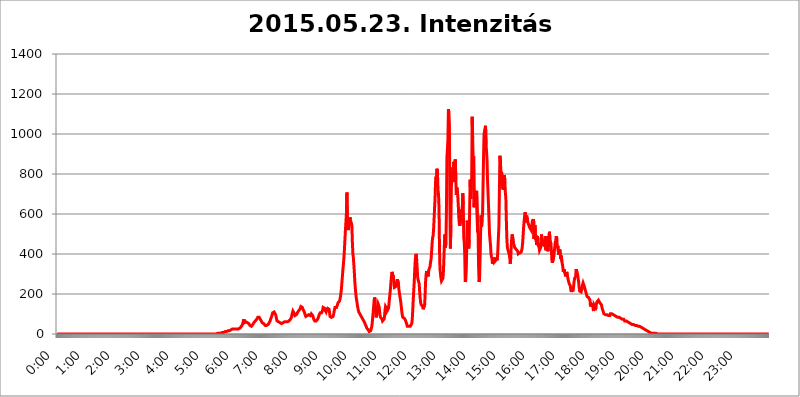
| Category | 2015.05.23. Intenzitás [W/m^2] |
|---|---|
| 0.0 | 0 |
| 0.0006944444444444445 | 0 |
| 0.001388888888888889 | 0 |
| 0.0020833333333333333 | 0 |
| 0.002777777777777778 | 0 |
| 0.003472222222222222 | 0 |
| 0.004166666666666667 | 0 |
| 0.004861111111111111 | 0 |
| 0.005555555555555556 | 0 |
| 0.0062499999999999995 | 0 |
| 0.006944444444444444 | 0 |
| 0.007638888888888889 | 0 |
| 0.008333333333333333 | 0 |
| 0.009027777777777779 | 0 |
| 0.009722222222222222 | 0 |
| 0.010416666666666666 | 0 |
| 0.011111111111111112 | 0 |
| 0.011805555555555555 | 0 |
| 0.012499999999999999 | 0 |
| 0.013194444444444444 | 0 |
| 0.013888888888888888 | 0 |
| 0.014583333333333332 | 0 |
| 0.015277777777777777 | 0 |
| 0.015972222222222224 | 0 |
| 0.016666666666666666 | 0 |
| 0.017361111111111112 | 0 |
| 0.018055555555555557 | 0 |
| 0.01875 | 0 |
| 0.019444444444444445 | 0 |
| 0.02013888888888889 | 0 |
| 0.020833333333333332 | 0 |
| 0.02152777777777778 | 0 |
| 0.022222222222222223 | 0 |
| 0.02291666666666667 | 0 |
| 0.02361111111111111 | 0 |
| 0.024305555555555556 | 0 |
| 0.024999999999999998 | 0 |
| 0.025694444444444447 | 0 |
| 0.02638888888888889 | 0 |
| 0.027083333333333334 | 0 |
| 0.027777777777777776 | 0 |
| 0.02847222222222222 | 0 |
| 0.029166666666666664 | 0 |
| 0.029861111111111113 | 0 |
| 0.030555555555555555 | 0 |
| 0.03125 | 0 |
| 0.03194444444444445 | 0 |
| 0.03263888888888889 | 0 |
| 0.03333333333333333 | 0 |
| 0.034027777777777775 | 0 |
| 0.034722222222222224 | 0 |
| 0.035416666666666666 | 0 |
| 0.036111111111111115 | 0 |
| 0.03680555555555556 | 0 |
| 0.0375 | 0 |
| 0.03819444444444444 | 0 |
| 0.03888888888888889 | 0 |
| 0.03958333333333333 | 0 |
| 0.04027777777777778 | 0 |
| 0.04097222222222222 | 0 |
| 0.041666666666666664 | 0 |
| 0.042361111111111106 | 0 |
| 0.04305555555555556 | 0 |
| 0.043750000000000004 | 0 |
| 0.044444444444444446 | 0 |
| 0.04513888888888889 | 0 |
| 0.04583333333333334 | 0 |
| 0.04652777777777778 | 0 |
| 0.04722222222222222 | 0 |
| 0.04791666666666666 | 0 |
| 0.04861111111111111 | 0 |
| 0.049305555555555554 | 0 |
| 0.049999999999999996 | 0 |
| 0.05069444444444445 | 0 |
| 0.051388888888888894 | 0 |
| 0.052083333333333336 | 0 |
| 0.05277777777777778 | 0 |
| 0.05347222222222222 | 0 |
| 0.05416666666666667 | 0 |
| 0.05486111111111111 | 0 |
| 0.05555555555555555 | 0 |
| 0.05625 | 0 |
| 0.05694444444444444 | 0 |
| 0.057638888888888885 | 0 |
| 0.05833333333333333 | 0 |
| 0.05902777777777778 | 0 |
| 0.059722222222222225 | 0 |
| 0.06041666666666667 | 0 |
| 0.061111111111111116 | 0 |
| 0.06180555555555556 | 0 |
| 0.0625 | 0 |
| 0.06319444444444444 | 0 |
| 0.06388888888888888 | 0 |
| 0.06458333333333334 | 0 |
| 0.06527777777777778 | 0 |
| 0.06597222222222222 | 0 |
| 0.06666666666666667 | 0 |
| 0.06736111111111111 | 0 |
| 0.06805555555555555 | 0 |
| 0.06874999999999999 | 0 |
| 0.06944444444444443 | 0 |
| 0.07013888888888889 | 0 |
| 0.07083333333333333 | 0 |
| 0.07152777777777779 | 0 |
| 0.07222222222222223 | 0 |
| 0.07291666666666667 | 0 |
| 0.07361111111111111 | 0 |
| 0.07430555555555556 | 0 |
| 0.075 | 0 |
| 0.07569444444444444 | 0 |
| 0.0763888888888889 | 0 |
| 0.07708333333333334 | 0 |
| 0.07777777777777778 | 0 |
| 0.07847222222222222 | 0 |
| 0.07916666666666666 | 0 |
| 0.0798611111111111 | 0 |
| 0.08055555555555556 | 0 |
| 0.08125 | 0 |
| 0.08194444444444444 | 0 |
| 0.08263888888888889 | 0 |
| 0.08333333333333333 | 0 |
| 0.08402777777777777 | 0 |
| 0.08472222222222221 | 0 |
| 0.08541666666666665 | 0 |
| 0.08611111111111112 | 0 |
| 0.08680555555555557 | 0 |
| 0.08750000000000001 | 0 |
| 0.08819444444444445 | 0 |
| 0.08888888888888889 | 0 |
| 0.08958333333333333 | 0 |
| 0.09027777777777778 | 0 |
| 0.09097222222222222 | 0 |
| 0.09166666666666667 | 0 |
| 0.09236111111111112 | 0 |
| 0.09305555555555556 | 0 |
| 0.09375 | 0 |
| 0.09444444444444444 | 0 |
| 0.09513888888888888 | 0 |
| 0.09583333333333333 | 0 |
| 0.09652777777777777 | 0 |
| 0.09722222222222222 | 0 |
| 0.09791666666666667 | 0 |
| 0.09861111111111111 | 0 |
| 0.09930555555555555 | 0 |
| 0.09999999999999999 | 0 |
| 0.10069444444444443 | 0 |
| 0.1013888888888889 | 0 |
| 0.10208333333333335 | 0 |
| 0.10277777777777779 | 0 |
| 0.10347222222222223 | 0 |
| 0.10416666666666667 | 0 |
| 0.10486111111111111 | 0 |
| 0.10555555555555556 | 0 |
| 0.10625 | 0 |
| 0.10694444444444444 | 0 |
| 0.1076388888888889 | 0 |
| 0.10833333333333334 | 0 |
| 0.10902777777777778 | 0 |
| 0.10972222222222222 | 0 |
| 0.1111111111111111 | 0 |
| 0.11180555555555556 | 0 |
| 0.11180555555555556 | 0 |
| 0.1125 | 0 |
| 0.11319444444444444 | 0 |
| 0.11388888888888889 | 0 |
| 0.11458333333333333 | 0 |
| 0.11527777777777777 | 0 |
| 0.11597222222222221 | 0 |
| 0.11666666666666665 | 0 |
| 0.1173611111111111 | 0 |
| 0.11805555555555557 | 0 |
| 0.11944444444444445 | 0 |
| 0.12013888888888889 | 0 |
| 0.12083333333333333 | 0 |
| 0.12152777777777778 | 0 |
| 0.12222222222222223 | 0 |
| 0.12291666666666667 | 0 |
| 0.12291666666666667 | 0 |
| 0.12361111111111112 | 0 |
| 0.12430555555555556 | 0 |
| 0.125 | 0 |
| 0.12569444444444444 | 0 |
| 0.12638888888888888 | 0 |
| 0.12708333333333333 | 0 |
| 0.16875 | 0 |
| 0.12847222222222224 | 0 |
| 0.12916666666666668 | 0 |
| 0.12986111111111112 | 0 |
| 0.13055555555555556 | 0 |
| 0.13125 | 0 |
| 0.13194444444444445 | 0 |
| 0.1326388888888889 | 0 |
| 0.13333333333333333 | 0 |
| 0.13402777777777777 | 0 |
| 0.13402777777777777 | 0 |
| 0.13472222222222222 | 0 |
| 0.13541666666666666 | 0 |
| 0.1361111111111111 | 0 |
| 0.13749999999999998 | 0 |
| 0.13819444444444443 | 0 |
| 0.1388888888888889 | 0 |
| 0.13958333333333334 | 0 |
| 0.14027777777777778 | 0 |
| 0.14097222222222222 | 0 |
| 0.14166666666666666 | 0 |
| 0.1423611111111111 | 0 |
| 0.14305555555555557 | 0 |
| 0.14375000000000002 | 0 |
| 0.14444444444444446 | 0 |
| 0.1451388888888889 | 0 |
| 0.1451388888888889 | 0 |
| 0.14652777777777778 | 0 |
| 0.14722222222222223 | 0 |
| 0.14791666666666667 | 0 |
| 0.1486111111111111 | 0 |
| 0.14930555555555555 | 0 |
| 0.15 | 0 |
| 0.15069444444444444 | 0 |
| 0.15138888888888888 | 0 |
| 0.15208333333333332 | 0 |
| 0.15277777777777776 | 0 |
| 0.15347222222222223 | 0 |
| 0.15416666666666667 | 0 |
| 0.15486111111111112 | 0 |
| 0.15555555555555556 | 0 |
| 0.15625 | 0 |
| 0.15694444444444444 | 0 |
| 0.15763888888888888 | 0 |
| 0.15833333333333333 | 0 |
| 0.15902777777777777 | 0 |
| 0.15972222222222224 | 0 |
| 0.16041666666666668 | 0 |
| 0.16111111111111112 | 0 |
| 0.16180555555555556 | 0 |
| 0.1625 | 0 |
| 0.16319444444444445 | 0 |
| 0.1638888888888889 | 0 |
| 0.16458333333333333 | 0 |
| 0.16527777777777777 | 0 |
| 0.16597222222222222 | 0 |
| 0.16666666666666666 | 0 |
| 0.1673611111111111 | 0 |
| 0.16805555555555554 | 0 |
| 0.16874999999999998 | 0 |
| 0.16944444444444443 | 0 |
| 0.17013888888888887 | 0 |
| 0.1708333333333333 | 0 |
| 0.17152777777777775 | 0 |
| 0.17222222222222225 | 0 |
| 0.1729166666666667 | 0 |
| 0.17361111111111113 | 0 |
| 0.17430555555555557 | 0 |
| 0.17500000000000002 | 0 |
| 0.17569444444444446 | 0 |
| 0.1763888888888889 | 0 |
| 0.17708333333333334 | 0 |
| 0.17777777777777778 | 0 |
| 0.17847222222222223 | 0 |
| 0.17916666666666667 | 0 |
| 0.1798611111111111 | 0 |
| 0.18055555555555555 | 0 |
| 0.18125 | 0 |
| 0.18194444444444444 | 0 |
| 0.1826388888888889 | 0 |
| 0.18333333333333335 | 0 |
| 0.1840277777777778 | 0 |
| 0.18472222222222223 | 0 |
| 0.18541666666666667 | 0 |
| 0.18611111111111112 | 0 |
| 0.18680555555555556 | 0 |
| 0.1875 | 0 |
| 0.18819444444444444 | 0 |
| 0.18888888888888888 | 0 |
| 0.18958333333333333 | 0 |
| 0.19027777777777777 | 0 |
| 0.1909722222222222 | 0 |
| 0.19166666666666665 | 0 |
| 0.19236111111111112 | 0 |
| 0.19305555555555554 | 0 |
| 0.19375 | 0 |
| 0.19444444444444445 | 0 |
| 0.1951388888888889 | 0 |
| 0.19583333333333333 | 0 |
| 0.19652777777777777 | 0 |
| 0.19722222222222222 | 0 |
| 0.19791666666666666 | 0 |
| 0.1986111111111111 | 0 |
| 0.19930555555555554 | 0 |
| 0.19999999999999998 | 0 |
| 0.20069444444444443 | 0 |
| 0.20138888888888887 | 0 |
| 0.2020833333333333 | 0 |
| 0.2027777777777778 | 0 |
| 0.2034722222222222 | 0 |
| 0.2041666666666667 | 0 |
| 0.20486111111111113 | 0 |
| 0.20555555555555557 | 0 |
| 0.20625000000000002 | 0 |
| 0.20694444444444446 | 0 |
| 0.2076388888888889 | 0 |
| 0.20833333333333334 | 0 |
| 0.20902777777777778 | 0 |
| 0.20972222222222223 | 0 |
| 0.21041666666666667 | 0 |
| 0.2111111111111111 | 0 |
| 0.21180555555555555 | 0 |
| 0.2125 | 0 |
| 0.21319444444444444 | 0 |
| 0.2138888888888889 | 0 |
| 0.21458333333333335 | 0 |
| 0.2152777777777778 | 0 |
| 0.21597222222222223 | 0 |
| 0.21666666666666667 | 0 |
| 0.21736111111111112 | 0 |
| 0.21805555555555556 | 0 |
| 0.21875 | 0 |
| 0.21944444444444444 | 0 |
| 0.22013888888888888 | 0 |
| 0.22083333333333333 | 0 |
| 0.22152777777777777 | 0 |
| 0.2222222222222222 | 0 |
| 0.22291666666666665 | 0 |
| 0.2236111111111111 | 3.525 |
| 0.22430555555555556 | 3.525 |
| 0.225 | 3.525 |
| 0.22569444444444445 | 3.525 |
| 0.2263888888888889 | 3.525 |
| 0.22708333333333333 | 3.525 |
| 0.22777777777777777 | 3.525 |
| 0.22847222222222222 | 3.525 |
| 0.22916666666666666 | 3.525 |
| 0.2298611111111111 | 3.525 |
| 0.23055555555555554 | 7.887 |
| 0.23124999999999998 | 7.887 |
| 0.23194444444444443 | 7.887 |
| 0.23263888888888887 | 7.887 |
| 0.2333333333333333 | 7.887 |
| 0.2340277777777778 | 7.887 |
| 0.2347222222222222 | 7.887 |
| 0.2354166666666667 | 12.257 |
| 0.23611111111111113 | 12.257 |
| 0.23680555555555557 | 12.257 |
| 0.23750000000000002 | 12.257 |
| 0.23819444444444446 | 12.257 |
| 0.2388888888888889 | 16.636 |
| 0.23958333333333334 | 16.636 |
| 0.24027777777777778 | 16.636 |
| 0.24097222222222223 | 16.636 |
| 0.24166666666666667 | 16.636 |
| 0.2423611111111111 | 21.024 |
| 0.24305555555555555 | 21.024 |
| 0.24375 | 21.024 |
| 0.24444444444444446 | 25.419 |
| 0.24513888888888888 | 25.419 |
| 0.24583333333333335 | 25.419 |
| 0.2465277777777778 | 25.419 |
| 0.24722222222222223 | 25.419 |
| 0.24791666666666667 | 25.419 |
| 0.24861111111111112 | 25.419 |
| 0.24930555555555556 | 25.419 |
| 0.25 | 25.419 |
| 0.25069444444444444 | 25.419 |
| 0.2513888888888889 | 25.419 |
| 0.2520833333333333 | 25.419 |
| 0.25277777777777777 | 25.419 |
| 0.2534722222222222 | 25.419 |
| 0.25416666666666665 | 25.419 |
| 0.2548611111111111 | 25.419 |
| 0.2555555555555556 | 29.823 |
| 0.25625000000000003 | 29.823 |
| 0.2569444444444445 | 29.823 |
| 0.2576388888888889 | 34.234 |
| 0.25833333333333336 | 38.653 |
| 0.2590277777777778 | 43.079 |
| 0.25972222222222224 | 47.511 |
| 0.2604166666666667 | 56.398 |
| 0.2611111111111111 | 60.85 |
| 0.26180555555555557 | 74.246 |
| 0.2625 | 56.398 |
| 0.26319444444444445 | 56.398 |
| 0.2638888888888889 | 60.85 |
| 0.26458333333333334 | 60.85 |
| 0.2652777777777778 | 60.85 |
| 0.2659722222222222 | 56.398 |
| 0.26666666666666666 | 56.398 |
| 0.2673611111111111 | 56.398 |
| 0.26805555555555555 | 56.398 |
| 0.26875 | 51.951 |
| 0.26944444444444443 | 47.511 |
| 0.2701388888888889 | 43.079 |
| 0.2708333333333333 | 43.079 |
| 0.27152777777777776 | 43.079 |
| 0.2722222222222222 | 38.653 |
| 0.27291666666666664 | 43.079 |
| 0.2736111111111111 | 43.079 |
| 0.2743055555555555 | 47.511 |
| 0.27499999999999997 | 51.951 |
| 0.27569444444444446 | 56.398 |
| 0.27638888888888885 | 60.85 |
| 0.27708333333333335 | 60.85 |
| 0.2777777777777778 | 65.31 |
| 0.27847222222222223 | 65.31 |
| 0.2791666666666667 | 69.775 |
| 0.2798611111111111 | 74.246 |
| 0.28055555555555556 | 78.722 |
| 0.28125 | 83.205 |
| 0.28194444444444444 | 87.692 |
| 0.2826388888888889 | 83.205 |
| 0.2833333333333333 | 83.205 |
| 0.28402777777777777 | 78.722 |
| 0.2847222222222222 | 74.246 |
| 0.28541666666666665 | 69.775 |
| 0.28611111111111115 | 65.31 |
| 0.28680555555555554 | 60.85 |
| 0.28750000000000003 | 56.398 |
| 0.2881944444444445 | 56.398 |
| 0.2888888888888889 | 56.398 |
| 0.28958333333333336 | 51.951 |
| 0.2902777777777778 | 47.511 |
| 0.29097222222222224 | 47.511 |
| 0.2916666666666667 | 43.079 |
| 0.2923611111111111 | 43.079 |
| 0.29305555555555557 | 43.079 |
| 0.29375 | 43.079 |
| 0.29444444444444445 | 43.079 |
| 0.2951388888888889 | 47.511 |
| 0.29583333333333334 | 47.511 |
| 0.2965277777777778 | 51.951 |
| 0.2972222222222222 | 56.398 |
| 0.29791666666666666 | 60.85 |
| 0.2986111111111111 | 65.31 |
| 0.29930555555555555 | 74.246 |
| 0.3 | 78.722 |
| 0.30069444444444443 | 87.692 |
| 0.3013888888888889 | 96.682 |
| 0.3020833333333333 | 105.69 |
| 0.30277777777777776 | 110.201 |
| 0.3034722222222222 | 110.201 |
| 0.30416666666666664 | 110.201 |
| 0.3048611111111111 | 110.201 |
| 0.3055555555555555 | 105.69 |
| 0.30624999999999997 | 96.682 |
| 0.3069444444444444 | 87.692 |
| 0.3076388888888889 | 74.246 |
| 0.30833333333333335 | 65.31 |
| 0.3090277777777778 | 60.85 |
| 0.30972222222222223 | 60.85 |
| 0.3104166666666667 | 60.85 |
| 0.3111111111111111 | 60.85 |
| 0.31180555555555556 | 56.398 |
| 0.3125 | 56.398 |
| 0.31319444444444444 | 56.398 |
| 0.3138888888888889 | 56.398 |
| 0.3145833333333333 | 51.951 |
| 0.31527777777777777 | 56.398 |
| 0.3159722222222222 | 56.398 |
| 0.31666666666666665 | 56.398 |
| 0.31736111111111115 | 56.398 |
| 0.31805555555555554 | 60.85 |
| 0.31875000000000003 | 60.85 |
| 0.3194444444444445 | 60.85 |
| 0.3201388888888889 | 60.85 |
| 0.32083333333333336 | 60.85 |
| 0.3215277777777778 | 60.85 |
| 0.32222222222222224 | 60.85 |
| 0.3229166666666667 | 60.85 |
| 0.3236111111111111 | 60.85 |
| 0.32430555555555557 | 60.85 |
| 0.325 | 65.31 |
| 0.32569444444444445 | 65.31 |
| 0.3263888888888889 | 69.775 |
| 0.32708333333333334 | 74.246 |
| 0.3277777777777778 | 78.722 |
| 0.3284722222222222 | 83.205 |
| 0.32916666666666666 | 96.682 |
| 0.3298611111111111 | 105.69 |
| 0.33055555555555555 | 114.716 |
| 0.33125 | 114.716 |
| 0.33194444444444443 | 110.201 |
| 0.3326388888888889 | 101.184 |
| 0.3333333333333333 | 92.184 |
| 0.3340277777777778 | 92.184 |
| 0.3347222222222222 | 92.184 |
| 0.3354166666666667 | 96.682 |
| 0.3361111111111111 | 101.184 |
| 0.3368055555555556 | 105.69 |
| 0.33749999999999997 | 110.201 |
| 0.33819444444444446 | 114.716 |
| 0.33888888888888885 | 119.235 |
| 0.33958333333333335 | 119.235 |
| 0.34027777777777773 | 123.758 |
| 0.34097222222222223 | 128.284 |
| 0.3416666666666666 | 137.347 |
| 0.3423611111111111 | 141.884 |
| 0.3430555555555555 | 137.347 |
| 0.34375 | 132.814 |
| 0.3444444444444445 | 128.284 |
| 0.3451388888888889 | 119.235 |
| 0.3458333333333334 | 114.716 |
| 0.34652777777777777 | 110.201 |
| 0.34722222222222227 | 101.184 |
| 0.34791666666666665 | 96.682 |
| 0.34861111111111115 | 87.692 |
| 0.34930555555555554 | 83.205 |
| 0.35000000000000003 | 87.692 |
| 0.3506944444444444 | 92.184 |
| 0.3513888888888889 | 96.682 |
| 0.3520833333333333 | 96.682 |
| 0.3527777777777778 | 96.682 |
| 0.3534722222222222 | 92.184 |
| 0.3541666666666667 | 92.184 |
| 0.3548611111111111 | 92.184 |
| 0.35555555555555557 | 96.682 |
| 0.35625 | 101.184 |
| 0.35694444444444445 | 101.184 |
| 0.3576388888888889 | 96.682 |
| 0.35833333333333334 | 92.184 |
| 0.3590277777777778 | 83.205 |
| 0.3597222222222222 | 74.246 |
| 0.36041666666666666 | 69.775 |
| 0.3611111111111111 | 65.31 |
| 0.36180555555555555 | 65.31 |
| 0.3625 | 65.31 |
| 0.36319444444444443 | 65.31 |
| 0.3638888888888889 | 69.775 |
| 0.3645833333333333 | 69.775 |
| 0.3652777777777778 | 74.246 |
| 0.3659722222222222 | 78.722 |
| 0.3666666666666667 | 87.692 |
| 0.3673611111111111 | 96.682 |
| 0.3680555555555556 | 101.184 |
| 0.36874999999999997 | 105.69 |
| 0.36944444444444446 | 105.69 |
| 0.37013888888888885 | 101.184 |
| 0.37083333333333335 | 105.69 |
| 0.37152777777777773 | 110.201 |
| 0.37222222222222223 | 119.235 |
| 0.3729166666666666 | 132.814 |
| 0.3736111111111111 | 137.347 |
| 0.3743055555555555 | 137.347 |
| 0.375 | 128.284 |
| 0.3756944444444445 | 119.235 |
| 0.3763888888888889 | 114.716 |
| 0.3770833333333334 | 110.201 |
| 0.37777777777777777 | 119.235 |
| 0.37847222222222227 | 123.758 |
| 0.37916666666666665 | 128.284 |
| 0.37986111111111115 | 128.284 |
| 0.38055555555555554 | 128.284 |
| 0.38125000000000003 | 123.758 |
| 0.3819444444444444 | 105.69 |
| 0.3826388888888889 | 87.692 |
| 0.3833333333333333 | 83.205 |
| 0.3840277777777778 | 83.205 |
| 0.3847222222222222 | 83.205 |
| 0.3854166666666667 | 78.722 |
| 0.3861111111111111 | 83.205 |
| 0.38680555555555557 | 87.692 |
| 0.3875 | 96.682 |
| 0.38819444444444445 | 110.201 |
| 0.3888888888888889 | 123.758 |
| 0.38958333333333334 | 132.814 |
| 0.3902777777777778 | 132.814 |
| 0.3909722222222222 | 132.814 |
| 0.39166666666666666 | 132.814 |
| 0.3923611111111111 | 137.347 |
| 0.39305555555555555 | 146.423 |
| 0.39375 | 155.509 |
| 0.39444444444444443 | 160.056 |
| 0.3951388888888889 | 160.056 |
| 0.3958333333333333 | 164.605 |
| 0.3965277777777778 | 173.709 |
| 0.3972222222222222 | 187.378 |
| 0.3979166666666667 | 205.62 |
| 0.3986111111111111 | 228.436 |
| 0.3993055555555556 | 260.373 |
| 0.39999999999999997 | 292.259 |
| 0.40069444444444446 | 324.052 |
| 0.40138888888888885 | 351.198 |
| 0.40208333333333335 | 382.715 |
| 0.40277777777777773 | 422.943 |
| 0.40347222222222223 | 471.582 |
| 0.4041666666666666 | 519.555 |
| 0.4048611111111111 | 558.261 |
| 0.4055555555555555 | 600.661 |
| 0.40625 | 707.8 |
| 0.4069444444444445 | 566.793 |
| 0.4076388888888889 | 532.513 |
| 0.4083333333333334 | 519.555 |
| 0.40902777777777777 | 523.88 |
| 0.40972222222222227 | 558.261 |
| 0.41041666666666665 | 583.779 |
| 0.41111111111111115 | 571.049 |
| 0.41180555555555554 | 562.53 |
| 0.41250000000000003 | 553.986 |
| 0.4131944444444444 | 545.416 |
| 0.4138888888888889 | 462.786 |
| 0.4145833333333333 | 405.108 |
| 0.4152777777777778 | 382.715 |
| 0.4159722222222222 | 378.224 |
| 0.4166666666666667 | 310.44 |
| 0.4173611111111111 | 260.373 |
| 0.41805555555555557 | 228.436 |
| 0.41875 | 201.058 |
| 0.41944444444444445 | 178.264 |
| 0.4201388888888889 | 164.605 |
| 0.42083333333333334 | 146.423 |
| 0.4215277777777778 | 132.814 |
| 0.4222222222222222 | 119.235 |
| 0.42291666666666666 | 110.201 |
| 0.4236111111111111 | 105.69 |
| 0.42430555555555555 | 101.184 |
| 0.425 | 96.682 |
| 0.42569444444444443 | 92.184 |
| 0.4263888888888889 | 87.692 |
| 0.4270833333333333 | 83.205 |
| 0.4277777777777778 | 78.722 |
| 0.4284722222222222 | 74.246 |
| 0.4291666666666667 | 69.775 |
| 0.4298611111111111 | 65.31 |
| 0.4305555555555556 | 65.31 |
| 0.43124999999999997 | 56.398 |
| 0.43194444444444446 | 47.511 |
| 0.43263888888888885 | 43.079 |
| 0.43333333333333335 | 38.653 |
| 0.43402777777777773 | 29.823 |
| 0.43472222222222223 | 29.823 |
| 0.4354166666666666 | 25.419 |
| 0.4361111111111111 | 21.024 |
| 0.4368055555555555 | 16.636 |
| 0.4375 | 12.257 |
| 0.4381944444444445 | 12.257 |
| 0.4388888888888889 | 12.257 |
| 0.4395833333333334 | 16.636 |
| 0.44027777777777777 | 25.419 |
| 0.44097222222222227 | 34.234 |
| 0.44166666666666665 | 51.951 |
| 0.44236111111111115 | 78.722 |
| 0.44305555555555554 | 105.69 |
| 0.44375000000000003 | 137.347 |
| 0.4444444444444444 | 169.156 |
| 0.4451388888888889 | 182.82 |
| 0.4458333333333333 | 169.156 |
| 0.4465277777777778 | 110.201 |
| 0.4472222222222222 | 83.205 |
| 0.4479166666666667 | 92.184 |
| 0.4486111111111111 | 119.235 |
| 0.44930555555555557 | 137.347 |
| 0.45 | 150.964 |
| 0.45069444444444445 | 155.509 |
| 0.4513888888888889 | 137.347 |
| 0.45208333333333334 | 114.716 |
| 0.4527777777777778 | 92.184 |
| 0.4534722222222222 | 83.205 |
| 0.45416666666666666 | 83.205 |
| 0.4548611111111111 | 83.205 |
| 0.45555555555555555 | 74.246 |
| 0.45625 | 65.31 |
| 0.45694444444444443 | 60.85 |
| 0.4576388888888889 | 65.31 |
| 0.4583333333333333 | 74.246 |
| 0.4590277777777778 | 87.692 |
| 0.4597222222222222 | 119.235 |
| 0.4604166666666667 | 137.347 |
| 0.4611111111111111 | 132.814 |
| 0.4618055555555556 | 128.284 |
| 0.46249999999999997 | 114.716 |
| 0.46319444444444446 | 114.716 |
| 0.46388888888888885 | 114.716 |
| 0.46458333333333335 | 128.284 |
| 0.46527777777777773 | 150.964 |
| 0.46597222222222223 | 178.264 |
| 0.4666666666666666 | 201.058 |
| 0.4673611111111111 | 228.436 |
| 0.4680555555555555 | 260.373 |
| 0.46875 | 287.709 |
| 0.4694444444444445 | 310.44 |
| 0.4701388888888889 | 314.98 |
| 0.4708333333333334 | 305.898 |
| 0.47152777777777777 | 283.156 |
| 0.47222222222222227 | 255.813 |
| 0.47291666666666665 | 233 |
| 0.47361111111111115 | 228.436 |
| 0.47430555555555554 | 233 |
| 0.47500000000000003 | 237.564 |
| 0.4756944444444444 | 246.689 |
| 0.4763888888888889 | 260.373 |
| 0.4770833333333333 | 274.047 |
| 0.4777777777777778 | 274.047 |
| 0.4784722222222222 | 251.251 |
| 0.4791666666666667 | 223.873 |
| 0.4798611111111111 | 205.62 |
| 0.48055555555555557 | 187.378 |
| 0.48125 | 173.709 |
| 0.48194444444444445 | 155.509 |
| 0.4826388888888889 | 132.814 |
| 0.48333333333333334 | 110.201 |
| 0.4840277777777778 | 92.184 |
| 0.4847222222222222 | 83.205 |
| 0.48541666666666666 | 78.722 |
| 0.4861111111111111 | 78.722 |
| 0.48680555555555555 | 78.722 |
| 0.4875 | 74.246 |
| 0.48819444444444443 | 69.775 |
| 0.4888888888888889 | 65.31 |
| 0.4895833333333333 | 56.398 |
| 0.4902777777777778 | 47.511 |
| 0.4909722222222222 | 38.653 |
| 0.4916666666666667 | 43.079 |
| 0.4923611111111111 | 43.079 |
| 0.4930555555555556 | 38.653 |
| 0.49374999999999997 | 34.234 |
| 0.49444444444444446 | 34.234 |
| 0.49513888888888885 | 38.653 |
| 0.49583333333333335 | 38.653 |
| 0.49652777777777773 | 43.079 |
| 0.49722222222222223 | 51.951 |
| 0.4979166666666666 | 74.246 |
| 0.4986111111111111 | 119.235 |
| 0.4993055555555555 | 173.709 |
| 0.5 | 219.309 |
| 0.5006944444444444 | 260.373 |
| 0.5013888888888889 | 319.517 |
| 0.5020833333333333 | 369.23 |
| 0.5027777777777778 | 391.685 |
| 0.5034722222222222 | 400.638 |
| 0.5041666666666667 | 369.23 |
| 0.5048611111111111 | 324.052 |
| 0.5055555555555555 | 278.603 |
| 0.50625 | 283.156 |
| 0.5069444444444444 | 283.156 |
| 0.5076388888888889 | 251.251 |
| 0.5083333333333333 | 210.182 |
| 0.5090277777777777 | 178.264 |
| 0.5097222222222222 | 155.509 |
| 0.5104166666666666 | 146.423 |
| 0.5111111111111112 | 146.423 |
| 0.5118055555555555 | 146.423 |
| 0.5125000000000001 | 137.347 |
| 0.5131944444444444 | 123.758 |
| 0.513888888888889 | 128.284 |
| 0.5145833333333333 | 128.284 |
| 0.5152777777777778 | 146.423 |
| 0.5159722222222222 | 201.058 |
| 0.5166666666666667 | 264.932 |
| 0.517361111111111 | 296.808 |
| 0.5180555555555556 | 314.98 |
| 0.5187499999999999 | 314.98 |
| 0.5194444444444445 | 296.808 |
| 0.5201388888888888 | 287.709 |
| 0.5208333333333334 | 314.98 |
| 0.5215277777777778 | 324.052 |
| 0.5222222222222223 | 324.052 |
| 0.5229166666666667 | 337.639 |
| 0.5236111111111111 | 360.221 |
| 0.5243055555555556 | 373.729 |
| 0.525 | 409.574 |
| 0.5256944444444445 | 449.551 |
| 0.5263888888888889 | 480.356 |
| 0.5270833333333333 | 489.108 |
| 0.5277777777777778 | 519.555 |
| 0.5284722222222222 | 571.049 |
| 0.5291666666666667 | 625.784 |
| 0.5298611111111111 | 675.311 |
| 0.5305555555555556 | 759.723 |
| 0.53125 | 787.258 |
| 0.5319444444444444 | 763.674 |
| 0.5326388888888889 | 826.123 |
| 0.5333333333333333 | 798.974 |
| 0.5340277777777778 | 719.877 |
| 0.5347222222222222 | 699.717 |
| 0.5354166666666667 | 629.948 |
| 0.5361111111111111 | 427.39 |
| 0.5368055555555555 | 324.052 |
| 0.5375 | 301.354 |
| 0.5381944444444444 | 278.603 |
| 0.5388888888888889 | 264.932 |
| 0.5395833333333333 | 269.49 |
| 0.5402777777777777 | 260.373 |
| 0.5409722222222222 | 278.603 |
| 0.5416666666666666 | 314.98 |
| 0.5423611111111112 | 387.202 |
| 0.5430555555555555 | 453.968 |
| 0.5437500000000001 | 497.836 |
| 0.5444444444444444 | 431.833 |
| 0.545138888888889 | 458.38 |
| 0.5458333333333333 | 613.252 |
| 0.5465277777777778 | 883.516 |
| 0.5472222222222222 | 925.06 |
| 0.5479166666666667 | 973.772 |
| 0.548611111111111 | 1124.056 |
| 0.5493055555555556 | 1105.019 |
| 0.5499999999999999 | 1048.508 |
| 0.5506944444444445 | 642.4 |
| 0.5513888888888888 | 427.39 |
| 0.5520833333333334 | 545.416 |
| 0.5527777777777778 | 739.877 |
| 0.5534722222222223 | 743.859 |
| 0.5541666666666667 | 802.868 |
| 0.5548611111111111 | 833.834 |
| 0.5555555555555556 | 818.392 |
| 0.55625 | 860.676 |
| 0.5569444444444445 | 771.559 |
| 0.5576388888888889 | 759.723 |
| 0.5583333333333333 | 872.114 |
| 0.5590277777777778 | 767.62 |
| 0.5597222222222222 | 695.666 |
| 0.5604166666666667 | 731.896 |
| 0.5611111111111111 | 719.877 |
| 0.5618055555555556 | 687.544 |
| 0.5625 | 642.4 |
| 0.5631944444444444 | 583.779 |
| 0.5638888888888889 | 549.704 |
| 0.5645833333333333 | 541.121 |
| 0.5652777777777778 | 536.82 |
| 0.5659722222222222 | 579.542 |
| 0.5666666666666667 | 621.613 |
| 0.5673611111111111 | 609.062 |
| 0.5680555555555555 | 625.784 |
| 0.56875 | 703.762 |
| 0.5694444444444444 | 646.537 |
| 0.5701388888888889 | 480.356 |
| 0.5708333333333333 | 458.38 |
| 0.5715277777777777 | 396.164 |
| 0.5722222222222222 | 260.373 |
| 0.5729166666666666 | 269.49 |
| 0.5736111111111112 | 319.517 |
| 0.5743055555555555 | 431.833 |
| 0.5750000000000001 | 566.793 |
| 0.5756944444444444 | 562.53 |
| 0.576388888888889 | 528.2 |
| 0.5770833333333333 | 427.39 |
| 0.5777777777777778 | 471.582 |
| 0.5784722222222222 | 642.4 |
| 0.5791666666666667 | 771.559 |
| 0.579861111111111 | 675.311 |
| 0.5805555555555556 | 767.62 |
| 0.5812499999999999 | 775.492 |
| 0.5819444444444445 | 1086.097 |
| 0.5826388888888888 | 981.244 |
| 0.5833333333333334 | 860.676 |
| 0.5840277777777778 | 887.309 |
| 0.5847222222222223 | 634.105 |
| 0.5854166666666667 | 683.473 |
| 0.5861111111111111 | 658.909 |
| 0.5868055555555556 | 642.4 |
| 0.5875 | 699.717 |
| 0.5881944444444445 | 715.858 |
| 0.5888888888888889 | 719.877 |
| 0.5895833333333333 | 510.885 |
| 0.5902777777777778 | 502.192 |
| 0.5909722222222222 | 333.113 |
| 0.5916666666666667 | 260.373 |
| 0.5923611111111111 | 278.603 |
| 0.5930555555555556 | 382.715 |
| 0.59375 | 502.192 |
| 0.5944444444444444 | 592.233 |
| 0.5951388888888889 | 536.82 |
| 0.5958333333333333 | 575.299 |
| 0.5965277777777778 | 596.45 |
| 0.5972222222222222 | 592.233 |
| 0.5979166666666667 | 891.099 |
| 0.5986111111111111 | 999.916 |
| 0.5993055555555555 | 1014.852 |
| 0.6 | 1011.118 |
| 0.6006944444444444 | 1041.019 |
| 0.6013888888888889 | 947.58 |
| 0.6020833333333333 | 913.766 |
| 0.6027777777777777 | 872.114 |
| 0.6034722222222222 | 771.559 |
| 0.6041666666666666 | 767.62 |
| 0.6048611111111112 | 642.4 |
| 0.6055555555555555 | 575.299 |
| 0.6062500000000001 | 502.192 |
| 0.6069444444444444 | 471.582 |
| 0.607638888888889 | 445.129 |
| 0.6083333333333333 | 400.638 |
| 0.6090277777777778 | 387.202 |
| 0.6097222222222222 | 378.224 |
| 0.6104166666666667 | 351.198 |
| 0.611111111111111 | 355.712 |
| 0.6118055555555556 | 364.728 |
| 0.6124999999999999 | 382.715 |
| 0.6131944444444445 | 360.221 |
| 0.6138888888888888 | 360.221 |
| 0.6145833333333334 | 355.712 |
| 0.6152777777777778 | 369.23 |
| 0.6159722222222223 | 382.715 |
| 0.6166666666666667 | 369.23 |
| 0.6173611111111111 | 378.224 |
| 0.6180555555555556 | 427.39 |
| 0.61875 | 484.735 |
| 0.6194444444444445 | 541.121 |
| 0.6201388888888889 | 719.877 |
| 0.6208333333333333 | 891.099 |
| 0.6215277777777778 | 864.493 |
| 0.6222222222222222 | 814.519 |
| 0.6229166666666667 | 810.641 |
| 0.6236111111111111 | 802.868 |
| 0.6243055555555556 | 798.974 |
| 0.625 | 723.889 |
| 0.6256944444444444 | 771.559 |
| 0.6263888888888889 | 719.877 |
| 0.6270833333333333 | 795.074 |
| 0.6277777777777778 | 767.62 |
| 0.6284722222222222 | 707.8 |
| 0.6291666666666667 | 679.395 |
| 0.6298611111111111 | 571.049 |
| 0.6305555555555555 | 480.356 |
| 0.63125 | 436.27 |
| 0.6319444444444444 | 422.943 |
| 0.6326388888888889 | 418.492 |
| 0.6333333333333333 | 418.492 |
| 0.6340277777777777 | 396.164 |
| 0.6347222222222222 | 378.224 |
| 0.6354166666666666 | 351.198 |
| 0.6361111111111112 | 387.202 |
| 0.6368055555555555 | 440.702 |
| 0.6375000000000001 | 484.735 |
| 0.6381944444444444 | 497.836 |
| 0.638888888888889 | 493.475 |
| 0.6395833333333333 | 458.38 |
| 0.6402777777777778 | 449.551 |
| 0.6409722222222222 | 440.702 |
| 0.6416666666666667 | 431.833 |
| 0.642361111111111 | 431.833 |
| 0.6430555555555556 | 427.39 |
| 0.6437499999999999 | 422.943 |
| 0.6444444444444445 | 422.943 |
| 0.6451388888888888 | 422.943 |
| 0.6458333333333334 | 414.035 |
| 0.6465277777777778 | 400.638 |
| 0.6472222222222223 | 400.638 |
| 0.6479166666666667 | 400.638 |
| 0.6486111111111111 | 405.108 |
| 0.6493055555555556 | 405.108 |
| 0.65 | 405.108 |
| 0.6506944444444445 | 409.574 |
| 0.6513888888888889 | 418.492 |
| 0.6520833333333333 | 431.833 |
| 0.6527777777777778 | 458.38 |
| 0.6534722222222222 | 497.836 |
| 0.6541666666666667 | 536.82 |
| 0.6548611111111111 | 566.793 |
| 0.6555555555555556 | 588.009 |
| 0.65625 | 609.062 |
| 0.6569444444444444 | 558.261 |
| 0.6576388888888889 | 583.779 |
| 0.6583333333333333 | 592.233 |
| 0.6590277777777778 | 588.009 |
| 0.6597222222222222 | 566.793 |
| 0.6604166666666667 | 553.986 |
| 0.6611111111111111 | 549.704 |
| 0.6618055555555555 | 553.986 |
| 0.6625 | 532.513 |
| 0.6631944444444444 | 528.2 |
| 0.6638888888888889 | 528.2 |
| 0.6645833333333333 | 519.555 |
| 0.6652777777777777 | 519.555 |
| 0.6659722222222222 | 515.223 |
| 0.6666666666666666 | 571.049 |
| 0.6673611111111111 | 532.513 |
| 0.6680555555555556 | 575.299 |
| 0.6687500000000001 | 475.972 |
| 0.6694444444444444 | 536.82 |
| 0.6701388888888888 | 545.416 |
| 0.6708333333333334 | 471.582 |
| 0.6715277777777778 | 493.475 |
| 0.6722222222222222 | 445.129 |
| 0.6729166666666666 | 449.551 |
| 0.6736111111111112 | 489.108 |
| 0.6743055555555556 | 445.129 |
| 0.6749999999999999 | 449.551 |
| 0.6756944444444444 | 436.27 |
| 0.6763888888888889 | 418.492 |
| 0.6770833333333334 | 414.035 |
| 0.6777777777777777 | 422.943 |
| 0.6784722222222223 | 436.27 |
| 0.6791666666666667 | 497.836 |
| 0.6798611111111111 | 475.972 |
| 0.6805555555555555 | 462.786 |
| 0.68125 | 471.582 |
| 0.6819444444444445 | 440.702 |
| 0.6826388888888889 | 467.187 |
| 0.6833333333333332 | 453.968 |
| 0.6840277777777778 | 436.27 |
| 0.6847222222222222 | 489.108 |
| 0.6854166666666667 | 418.492 |
| 0.686111111111111 | 489.108 |
| 0.6868055555555556 | 431.833 |
| 0.6875 | 467.187 |
| 0.6881944444444444 | 414.035 |
| 0.688888888888889 | 471.582 |
| 0.6895833333333333 | 436.27 |
| 0.6902777777777778 | 510.885 |
| 0.6909722222222222 | 475.972 |
| 0.6916666666666668 | 462.786 |
| 0.6923611111111111 | 453.968 |
| 0.6930555555555555 | 418.492 |
| 0.69375 | 369.23 |
| 0.6944444444444445 | 355.712 |
| 0.6951388888888889 | 351.198 |
| 0.6958333333333333 | 360.221 |
| 0.6965277777777777 | 391.685 |
| 0.6972222222222223 | 387.202 |
| 0.6979166666666666 | 396.164 |
| 0.6986111111111111 | 462.786 |
| 0.6993055555555556 | 453.968 |
| 0.7000000000000001 | 489.108 |
| 0.7006944444444444 | 475.972 |
| 0.7013888888888888 | 431.833 |
| 0.7020833333333334 | 440.702 |
| 0.7027777777777778 | 414.035 |
| 0.7034722222222222 | 396.164 |
| 0.7041666666666666 | 409.574 |
| 0.7048611111111112 | 422.943 |
| 0.7055555555555556 | 400.638 |
| 0.7062499999999999 | 373.729 |
| 0.7069444444444444 | 391.685 |
| 0.7076388888888889 | 364.728 |
| 0.7083333333333334 | 364.728 |
| 0.7090277777777777 | 337.639 |
| 0.7097222222222223 | 310.44 |
| 0.7104166666666667 | 305.898 |
| 0.7111111111111111 | 324.052 |
| 0.7118055555555555 | 305.898 |
| 0.7125 | 301.354 |
| 0.7131944444444445 | 287.709 |
| 0.7138888888888889 | 283.156 |
| 0.7145833333333332 | 310.44 |
| 0.7152777777777778 | 296.808 |
| 0.7159722222222222 | 283.156 |
| 0.7166666666666667 | 269.49 |
| 0.717361111111111 | 260.373 |
| 0.7180555555555556 | 251.251 |
| 0.71875 | 246.689 |
| 0.7194444444444444 | 242.127 |
| 0.720138888888889 | 242.127 |
| 0.7208333333333333 | 210.182 |
| 0.7215277777777778 | 219.309 |
| 0.7222222222222222 | 214.746 |
| 0.7229166666666668 | 214.746 |
| 0.7236111111111111 | 219.309 |
| 0.7243055555555555 | 242.127 |
| 0.725 | 264.932 |
| 0.7256944444444445 | 278.603 |
| 0.7263888888888889 | 278.603 |
| 0.7270833333333333 | 287.709 |
| 0.7277777777777777 | 324.052 |
| 0.7284722222222223 | 319.517 |
| 0.7291666666666666 | 305.898 |
| 0.7298611111111111 | 296.808 |
| 0.7305555555555556 | 278.603 |
| 0.7312500000000001 | 260.373 |
| 0.7319444444444444 | 233 |
| 0.7326388888888888 | 214.746 |
| 0.7333333333333334 | 210.182 |
| 0.7340277777777778 | 210.182 |
| 0.7347222222222222 | 210.182 |
| 0.7354166666666666 | 219.309 |
| 0.7361111111111112 | 233 |
| 0.7368055555555556 | 246.689 |
| 0.7374999999999999 | 255.813 |
| 0.7381944444444444 | 251.251 |
| 0.7388888888888889 | 242.127 |
| 0.7395833333333334 | 233 |
| 0.7402777777777777 | 223.873 |
| 0.7409722222222223 | 214.746 |
| 0.7416666666666667 | 205.62 |
| 0.7423611111111111 | 196.497 |
| 0.7430555555555555 | 187.378 |
| 0.74375 | 187.378 |
| 0.7444444444444445 | 182.82 |
| 0.7451388888888889 | 182.82 |
| 0.7458333333333332 | 178.264 |
| 0.7465277777777778 | 178.264 |
| 0.7472222222222222 | 169.156 |
| 0.7479166666666667 | 137.347 |
| 0.748611111111111 | 150.964 |
| 0.7493055555555556 | 155.509 |
| 0.75 | 150.964 |
| 0.7506944444444444 | 146.423 |
| 0.751388888888889 | 132.814 |
| 0.7520833333333333 | 114.716 |
| 0.7527777777777778 | 146.423 |
| 0.7534722222222222 | 146.423 |
| 0.7541666666666668 | 137.347 |
| 0.7548611111111111 | 119.235 |
| 0.7555555555555555 | 137.347 |
| 0.75625 | 150.964 |
| 0.7569444444444445 | 160.056 |
| 0.7576388888888889 | 164.605 |
| 0.7583333333333333 | 164.605 |
| 0.7590277777777777 | 169.156 |
| 0.7597222222222223 | 164.605 |
| 0.7604166666666666 | 164.605 |
| 0.7611111111111111 | 155.509 |
| 0.7618055555555556 | 155.509 |
| 0.7625000000000001 | 155.509 |
| 0.7631944444444444 | 146.423 |
| 0.7638888888888888 | 141.884 |
| 0.7645833333333334 | 123.758 |
| 0.7652777777777778 | 119.235 |
| 0.7659722222222222 | 110.201 |
| 0.7666666666666666 | 101.184 |
| 0.7673611111111112 | 96.682 |
| 0.7680555555555556 | 96.682 |
| 0.7687499999999999 | 96.682 |
| 0.7694444444444444 | 96.682 |
| 0.7701388888888889 | 96.682 |
| 0.7708333333333334 | 96.682 |
| 0.7715277777777777 | 92.184 |
| 0.7722222222222223 | 92.184 |
| 0.7729166666666667 | 92.184 |
| 0.7736111111111111 | 92.184 |
| 0.7743055555555555 | 87.692 |
| 0.775 | 92.184 |
| 0.7756944444444445 | 101.184 |
| 0.7763888888888889 | 105.69 |
| 0.7770833333333332 | 101.184 |
| 0.7777777777777778 | 101.184 |
| 0.7784722222222222 | 101.184 |
| 0.7791666666666667 | 96.682 |
| 0.779861111111111 | 96.682 |
| 0.7805555555555556 | 96.682 |
| 0.78125 | 92.184 |
| 0.7819444444444444 | 92.184 |
| 0.782638888888889 | 92.184 |
| 0.7833333333333333 | 92.184 |
| 0.7840277777777778 | 87.692 |
| 0.7847222222222222 | 87.692 |
| 0.7854166666666668 | 87.692 |
| 0.7861111111111111 | 83.205 |
| 0.7868055555555555 | 83.205 |
| 0.7875 | 83.205 |
| 0.7881944444444445 | 83.205 |
| 0.7888888888888889 | 83.205 |
| 0.7895833333333333 | 78.722 |
| 0.7902777777777777 | 78.722 |
| 0.7909722222222223 | 78.722 |
| 0.7916666666666666 | 78.722 |
| 0.7923611111111111 | 74.246 |
| 0.7930555555555556 | 74.246 |
| 0.7937500000000001 | 69.775 |
| 0.7944444444444444 | 74.246 |
| 0.7951388888888888 | 69.775 |
| 0.7958333333333334 | 65.31 |
| 0.7965277777777778 | 69.775 |
| 0.7972222222222222 | 69.775 |
| 0.7979166666666666 | 65.31 |
| 0.7986111111111112 | 65.31 |
| 0.7993055555555556 | 60.85 |
| 0.7999999999999999 | 60.85 |
| 0.8006944444444444 | 56.398 |
| 0.8013888888888889 | 56.398 |
| 0.8020833333333334 | 56.398 |
| 0.8027777777777777 | 51.951 |
| 0.8034722222222223 | 51.951 |
| 0.8041666666666667 | 51.951 |
| 0.8048611111111111 | 47.511 |
| 0.8055555555555555 | 47.511 |
| 0.80625 | 47.511 |
| 0.8069444444444445 | 47.511 |
| 0.8076388888888889 | 47.511 |
| 0.8083333333333332 | 47.511 |
| 0.8090277777777778 | 47.511 |
| 0.8097222222222222 | 43.079 |
| 0.8104166666666667 | 43.079 |
| 0.811111111111111 | 43.079 |
| 0.8118055555555556 | 43.079 |
| 0.8125 | 43.079 |
| 0.8131944444444444 | 43.079 |
| 0.813888888888889 | 38.653 |
| 0.8145833333333333 | 38.653 |
| 0.8152777777777778 | 38.653 |
| 0.8159722222222222 | 38.653 |
| 0.8166666666666668 | 38.653 |
| 0.8173611111111111 | 34.234 |
| 0.8180555555555555 | 34.234 |
| 0.81875 | 34.234 |
| 0.8194444444444445 | 34.234 |
| 0.8201388888888889 | 29.823 |
| 0.8208333333333333 | 29.823 |
| 0.8215277777777777 | 29.823 |
| 0.8222222222222223 | 29.823 |
| 0.8229166666666666 | 25.419 |
| 0.8236111111111111 | 25.419 |
| 0.8243055555555556 | 25.419 |
| 0.8250000000000001 | 21.024 |
| 0.8256944444444444 | 21.024 |
| 0.8263888888888888 | 21.024 |
| 0.8270833333333334 | 16.636 |
| 0.8277777777777778 | 16.636 |
| 0.8284722222222222 | 16.636 |
| 0.8291666666666666 | 12.257 |
| 0.8298611111111112 | 12.257 |
| 0.8305555555555556 | 12.257 |
| 0.8312499999999999 | 7.887 |
| 0.8319444444444444 | 7.887 |
| 0.8326388888888889 | 7.887 |
| 0.8333333333333334 | 3.525 |
| 0.8340277777777777 | 3.525 |
| 0.8347222222222223 | 3.525 |
| 0.8354166666666667 | 3.525 |
| 0.8361111111111111 | 3.525 |
| 0.8368055555555555 | 3.525 |
| 0.8375 | 3.525 |
| 0.8381944444444445 | 3.525 |
| 0.8388888888888889 | 3.525 |
| 0.8395833333333332 | 3.525 |
| 0.8402777777777778 | 0 |
| 0.8409722222222222 | 0 |
| 0.8416666666666667 | 0 |
| 0.842361111111111 | 0 |
| 0.8430555555555556 | 0 |
| 0.84375 | 0 |
| 0.8444444444444444 | 0 |
| 0.845138888888889 | 0 |
| 0.8458333333333333 | 0 |
| 0.8465277777777778 | 0 |
| 0.8472222222222222 | 0 |
| 0.8479166666666668 | 0 |
| 0.8486111111111111 | 0 |
| 0.8493055555555555 | 0 |
| 0.85 | 0 |
| 0.8506944444444445 | 0 |
| 0.8513888888888889 | 0 |
| 0.8520833333333333 | 0 |
| 0.8527777777777777 | 0 |
| 0.8534722222222223 | 0 |
| 0.8541666666666666 | 0 |
| 0.8548611111111111 | 0 |
| 0.8555555555555556 | 0 |
| 0.8562500000000001 | 0 |
| 0.8569444444444444 | 0 |
| 0.8576388888888888 | 0 |
| 0.8583333333333334 | 0 |
| 0.8590277777777778 | 0 |
| 0.8597222222222222 | 0 |
| 0.8604166666666666 | 0 |
| 0.8611111111111112 | 0 |
| 0.8618055555555556 | 0 |
| 0.8624999999999999 | 0 |
| 0.8631944444444444 | 0 |
| 0.8638888888888889 | 0 |
| 0.8645833333333334 | 0 |
| 0.8652777777777777 | 0 |
| 0.8659722222222223 | 0 |
| 0.8666666666666667 | 0 |
| 0.8673611111111111 | 0 |
| 0.8680555555555555 | 0 |
| 0.86875 | 0 |
| 0.8694444444444445 | 0 |
| 0.8701388888888889 | 0 |
| 0.8708333333333332 | 0 |
| 0.8715277777777778 | 0 |
| 0.8722222222222222 | 0 |
| 0.8729166666666667 | 0 |
| 0.873611111111111 | 0 |
| 0.8743055555555556 | 0 |
| 0.875 | 0 |
| 0.8756944444444444 | 0 |
| 0.876388888888889 | 0 |
| 0.8770833333333333 | 0 |
| 0.8777777777777778 | 0 |
| 0.8784722222222222 | 0 |
| 0.8791666666666668 | 0 |
| 0.8798611111111111 | 0 |
| 0.8805555555555555 | 0 |
| 0.88125 | 0 |
| 0.8819444444444445 | 0 |
| 0.8826388888888889 | 0 |
| 0.8833333333333333 | 0 |
| 0.8840277777777777 | 0 |
| 0.8847222222222223 | 0 |
| 0.8854166666666666 | 0 |
| 0.8861111111111111 | 0 |
| 0.8868055555555556 | 0 |
| 0.8875000000000001 | 0 |
| 0.8881944444444444 | 0 |
| 0.8888888888888888 | 0 |
| 0.8895833333333334 | 0 |
| 0.8902777777777778 | 0 |
| 0.8909722222222222 | 0 |
| 0.8916666666666666 | 0 |
| 0.8923611111111112 | 0 |
| 0.8930555555555556 | 0 |
| 0.8937499999999999 | 0 |
| 0.8944444444444444 | 0 |
| 0.8951388888888889 | 0 |
| 0.8958333333333334 | 0 |
| 0.8965277777777777 | 0 |
| 0.8972222222222223 | 0 |
| 0.8979166666666667 | 0 |
| 0.8986111111111111 | 0 |
| 0.8993055555555555 | 0 |
| 0.9 | 0 |
| 0.9006944444444445 | 0 |
| 0.9013888888888889 | 0 |
| 0.9020833333333332 | 0 |
| 0.9027777777777778 | 0 |
| 0.9034722222222222 | 0 |
| 0.9041666666666667 | 0 |
| 0.904861111111111 | 0 |
| 0.9055555555555556 | 0 |
| 0.90625 | 0 |
| 0.9069444444444444 | 0 |
| 0.907638888888889 | 0 |
| 0.9083333333333333 | 0 |
| 0.9090277777777778 | 0 |
| 0.9097222222222222 | 0 |
| 0.9104166666666668 | 0 |
| 0.9111111111111111 | 0 |
| 0.9118055555555555 | 0 |
| 0.9125 | 0 |
| 0.9131944444444445 | 0 |
| 0.9138888888888889 | 0 |
| 0.9145833333333333 | 0 |
| 0.9152777777777777 | 0 |
| 0.9159722222222223 | 0 |
| 0.9166666666666666 | 0 |
| 0.9173611111111111 | 0 |
| 0.9180555555555556 | 0 |
| 0.9187500000000001 | 0 |
| 0.9194444444444444 | 0 |
| 0.9201388888888888 | 0 |
| 0.9208333333333334 | 0 |
| 0.9215277777777778 | 0 |
| 0.9222222222222222 | 0 |
| 0.9229166666666666 | 0 |
| 0.9236111111111112 | 0 |
| 0.9243055555555556 | 0 |
| 0.9249999999999999 | 0 |
| 0.9256944444444444 | 0 |
| 0.9263888888888889 | 0 |
| 0.9270833333333334 | 0 |
| 0.9277777777777777 | 0 |
| 0.9284722222222223 | 0 |
| 0.9291666666666667 | 0 |
| 0.9298611111111111 | 0 |
| 0.9305555555555555 | 0 |
| 0.93125 | 0 |
| 0.9319444444444445 | 0 |
| 0.9326388888888889 | 0 |
| 0.9333333333333332 | 0 |
| 0.9340277777777778 | 0 |
| 0.9347222222222222 | 0 |
| 0.9354166666666667 | 0 |
| 0.936111111111111 | 0 |
| 0.9368055555555556 | 0 |
| 0.9375 | 0 |
| 0.9381944444444444 | 0 |
| 0.938888888888889 | 0 |
| 0.9395833333333333 | 0 |
| 0.9402777777777778 | 0 |
| 0.9409722222222222 | 0 |
| 0.9416666666666668 | 0 |
| 0.9423611111111111 | 0 |
| 0.9430555555555555 | 0 |
| 0.94375 | 0 |
| 0.9444444444444445 | 0 |
| 0.9451388888888889 | 0 |
| 0.9458333333333333 | 0 |
| 0.9465277777777777 | 0 |
| 0.9472222222222223 | 0 |
| 0.9479166666666666 | 0 |
| 0.9486111111111111 | 0 |
| 0.9493055555555556 | 0 |
| 0.9500000000000001 | 0 |
| 0.9506944444444444 | 0 |
| 0.9513888888888888 | 0 |
| 0.9520833333333334 | 0 |
| 0.9527777777777778 | 0 |
| 0.9534722222222222 | 0 |
| 0.9541666666666666 | 0 |
| 0.9548611111111112 | 0 |
| 0.9555555555555556 | 0 |
| 0.9562499999999999 | 0 |
| 0.9569444444444444 | 0 |
| 0.9576388888888889 | 0 |
| 0.9583333333333334 | 0 |
| 0.9590277777777777 | 0 |
| 0.9597222222222223 | 0 |
| 0.9604166666666667 | 0 |
| 0.9611111111111111 | 0 |
| 0.9618055555555555 | 0 |
| 0.9625 | 0 |
| 0.9631944444444445 | 0 |
| 0.9638888888888889 | 0 |
| 0.9645833333333332 | 0 |
| 0.9652777777777778 | 0 |
| 0.9659722222222222 | 0 |
| 0.9666666666666667 | 0 |
| 0.967361111111111 | 0 |
| 0.9680555555555556 | 0 |
| 0.96875 | 0 |
| 0.9694444444444444 | 0 |
| 0.970138888888889 | 0 |
| 0.9708333333333333 | 0 |
| 0.9715277777777778 | 0 |
| 0.9722222222222222 | 0 |
| 0.9729166666666668 | 0 |
| 0.9736111111111111 | 0 |
| 0.9743055555555555 | 0 |
| 0.975 | 0 |
| 0.9756944444444445 | 0 |
| 0.9763888888888889 | 0 |
| 0.9770833333333333 | 0 |
| 0.9777777777777777 | 0 |
| 0.9784722222222223 | 0 |
| 0.9791666666666666 | 0 |
| 0.9798611111111111 | 0 |
| 0.9805555555555556 | 0 |
| 0.9812500000000001 | 0 |
| 0.9819444444444444 | 0 |
| 0.9826388888888888 | 0 |
| 0.9833333333333334 | 0 |
| 0.9840277777777778 | 0 |
| 0.9847222222222222 | 0 |
| 0.9854166666666666 | 0 |
| 0.9861111111111112 | 0 |
| 0.9868055555555556 | 0 |
| 0.9874999999999999 | 0 |
| 0.9881944444444444 | 0 |
| 0.9888888888888889 | 0 |
| 0.9895833333333334 | 0 |
| 0.9902777777777777 | 0 |
| 0.9909722222222223 | 0 |
| 0.9916666666666667 | 0 |
| 0.9923611111111111 | 0 |
| 0.9930555555555555 | 0 |
| 0.99375 | 0 |
| 0.9944444444444445 | 0 |
| 0.9951388888888889 | 0 |
| 0.9958333333333332 | 0 |
| 0.9965277777777778 | 0 |
| 0.9972222222222222 | 0 |
| 0.9979166666666667 | 0 |
| 0.998611111111111 | 0 |
| 0.9993055555555556 | 0 |